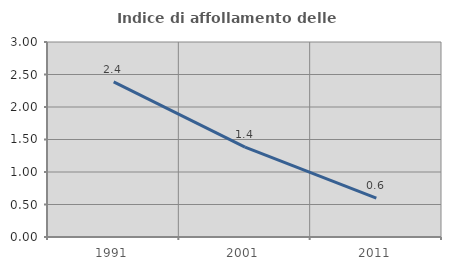
| Category | Indice di affollamento delle abitazioni  |
|---|---|
| 1991.0 | 2.388 |
| 2001.0 | 1.384 |
| 2011.0 | 0.599 |